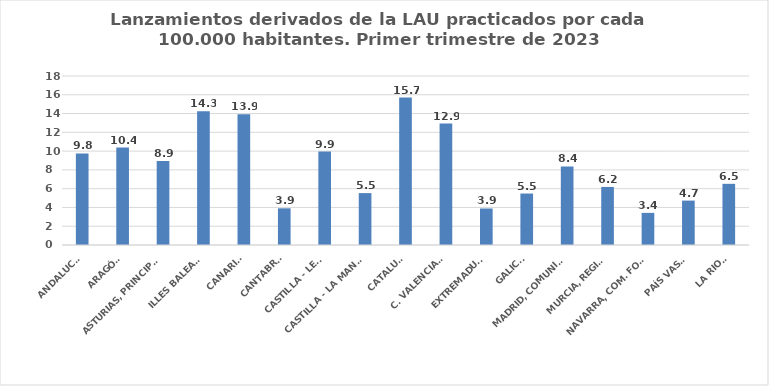
| Category | Series 0 |
|---|---|
| ANDALUCÍA | 9.754 |
| ARAGÓN | 10.376 |
| ASTURIAS, PRINCIPADO | 8.941 |
| ILLES BALEARS | 14.253 |
| CANARIAS | 13.918 |
| CANTABRIA | 3.908 |
| CASTILLA - LEÓN | 9.947 |
| CASTILLA - LA MANCHA | 5.527 |
| CATALUÑA | 15.698 |
| C. VALENCIANA | 12.935 |
| EXTREMADURA | 3.889 |
| GALICIA | 5.482 |
| MADRID, COMUNIDAD | 8.366 |
| MURCIA, REGIÓN | 6.183 |
| NAVARRA, COM. FORAL | 3.422 |
| PAÍS VASCO | 4.73 |
| LA RIOJA | 6.516 |